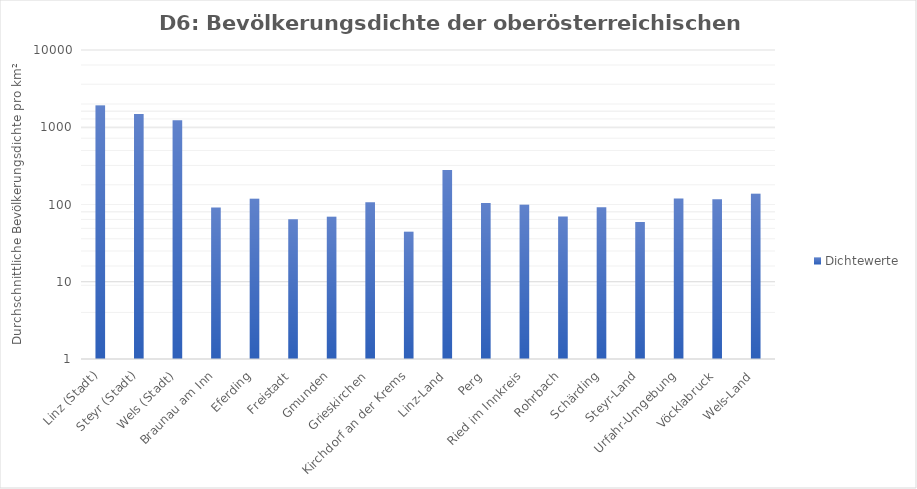
| Category | Dichtewerte |
|---|---|
| Linz (Stadt) | 1911.898 |
| Steyr (Stadt) | 1481.175 |
| Wels (Stadt) | 1229.922 |
| Braunau am Inn | 91.494 |
| Eferding | 118.392 |
| Freistadt | 64.403 |
| Gmunden | 69.352 |
| Grieskirchen | 107.014 |
| Kirchdorf an der Krems | 44.497 |
| Linz-Land | 280.411 |
| Perg | 104.243 |
| Ried im Innkreis | 99.491 |
| Rohrbach | 69.943 |
| Schärding | 92.153 |
| Steyr-Land | 59.289 |
| Urfahr-Umgebung | 119.726 |
| Vöcklabruck | 116.761 |
| Wels-Land | 137.666 |